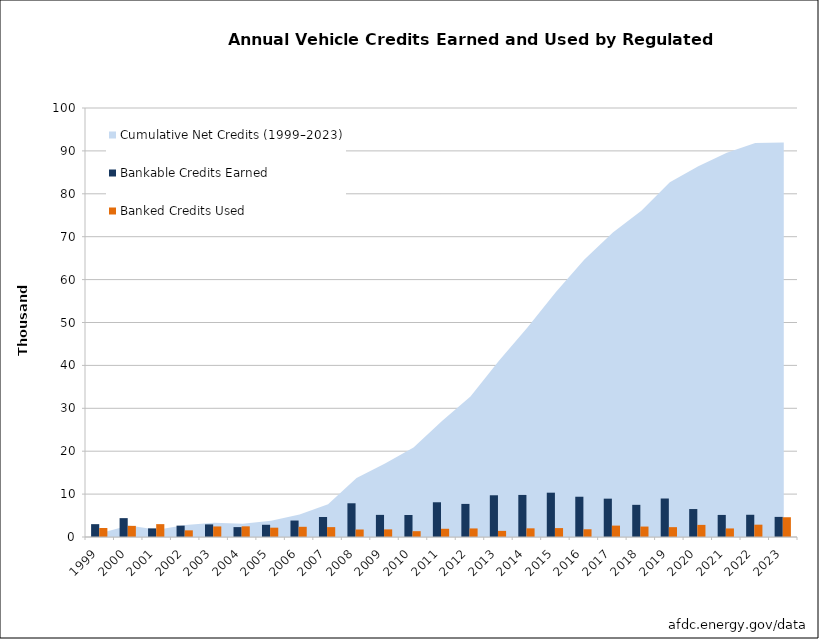
| Category | Bankable Credits Earned | Banked Credits Used |
|---|---|---|
| 1999.0 | 2994 | 2095 |
| 2000.0 | 4398 | 2595 |
| 2001.0 | 2010 | 2998 |
| 2002.0 | 2652 | 1551 |
| 2003.0 | 2938 | 2459 |
| 2004.0 | 2307 | 2486 |
| 2005.0 | 2850 | 2172 |
| 2006.0 | 3840 | 2376 |
| 2007.0 | 4665 | 2304 |
| 2008.0 | 7862 | 1748 |
| 2009.0 | 5156 | 1776 |
| 2010.0 | 5126 | 1360 |
| 2011.0 | 8097 | 1918 |
| 2012.0 | 7714 | 1996 |
| 2013.0 | 9727 | 1427 |
| 2014.0 | 9805 | 2022 |
| 2015.0 | 10330 | 2078 |
| 2016.0 | 9386 | 1804 |
| 2017.0 | 8937 | 2655 |
| 2018.0 | 7498 | 2435 |
| 2019.0 | 8973 | 2296 |
| 2020.0 | 6517 | 2824 |
| 2021.0 | 5145 | 1997 |
| 2022.0 | 5182 | 2872 |
| 2023.0 | 4686 | 4607 |